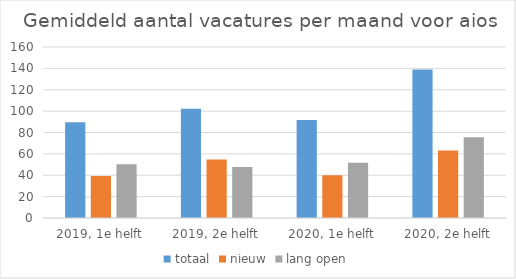
| Category | totaal | nieuw | lang open |
|---|---|---|---|
| 2019, 1e helft | 89.667 | 39.333 | 50.333 |
| 2019, 2e helft | 102.333 | 54.667 | 47.667 |
| 2020, 1e helft | 91.667 | 40 | 51.667 |
| 2020, 2e helft | 138.833 | 63.167 | 75.667 |